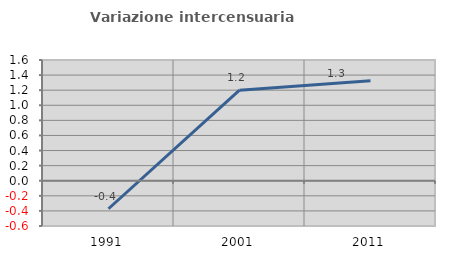
| Category | Variazione intercensuaria annua |
|---|---|
| 1991.0 | -0.371 |
| 2001.0 | 1.2 |
| 2011.0 | 1.326 |